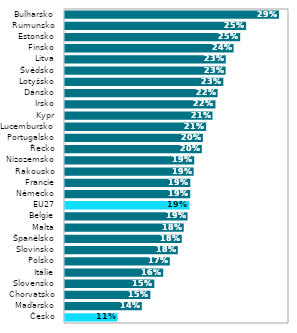
| Category | Series 0 |
|---|---|
| Česko | 0.109 |
| Maďarsko | 0.136 |
| Chorvatsko | 0.145 |
| Slovensko | 0.15 |
| Itálie | 0.16 |
| Polsko | 0.167 |
| Slovinsko | 0.176 |
| Španělsko | 0.18 |
| Malta | 0.182 |
| Belgie | 0.187 |
| EU27 | 0.189 |
| Německo | 0.19 |
| Francie | 0.19 |
| Rakousko | 0.194 |
| Nizozemsko | 0.194 |
| Řecko | 0.203 |
| Portugalsko | 0.204 |
| Lucembursko | 0.207 |
| Kypr | 0.215 |
| Irsko | 0.218 |
| Dánsko | 0.22 |
| Lotyšsko | 0.227 |
| Švédsko | 0.229 |
| Litva | 0.229 |
| Finsko | 0.238 |
| Estonsko | 0.246 |
| Rumunsko | 0.252 |
| Bulharsko | 0.289 |